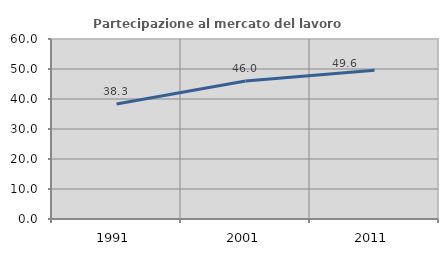
| Category | Partecipazione al mercato del lavoro  femminile |
|---|---|
| 1991.0 | 38.323 |
| 2001.0 | 45.985 |
| 2011.0 | 49.611 |